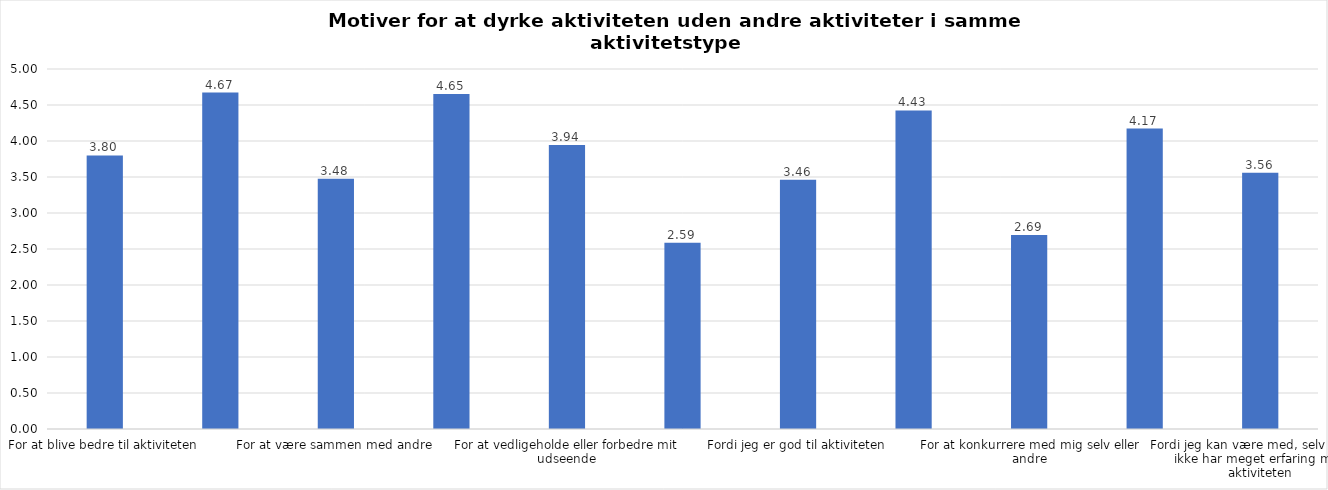
| Category | Gennemsnit |
|---|---|
| For at blive bedre til aktiviteten | 3.799 |
| For at vedligeholde eller forbedre min sundhed (fx helbred, fysisk form) | 4.672 |
| For at være sammen med andre | 3.477 |
| For at gøre noget godt for mig selv | 4.652 |
| For at vedligeholde eller forbedre mit udseende | 3.943 |
| Fordi andre i min omgangskreds opmuntrer mig til det | 2.586 |
| Fordi jeg er god til aktiviteten | 3.462 |
| Fordi jeg godt kan lide aktiviteten | 4.425 |
| For at konkurrere med mig selv eller andre | 2.695 |
| Fordi aktiviteten passer godt ind i min hverdag | 4.172 |
| Fordi jeg kan være med, selv om jeg ikke har meget erfaring med aktiviteten | 3.558 |